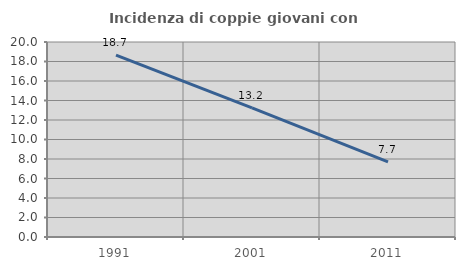
| Category | Incidenza di coppie giovani con figli |
|---|---|
| 1991.0 | 18.659 |
| 2001.0 | 13.235 |
| 2011.0 | 7.715 |